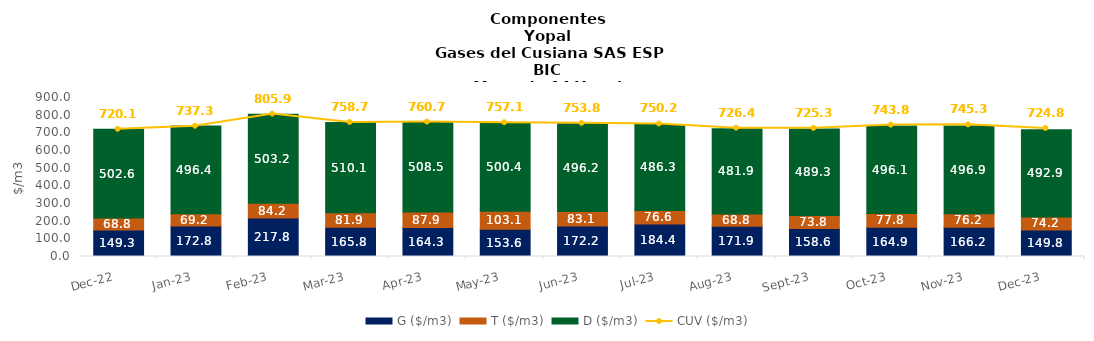
| Category | G ($/m3) | T ($/m3) | D ($/m3) |
|---|---|---|---|
| 2022-12-01 | 149.33 | 68.76 | 502.55 |
| 2023-01-01 | 172.82 | 69.18 | 496.38 |
| 2023-02-01 | 217.82 | 84.19 | 503.15 |
| 2023-03-01 | 165.84 | 81.88 | 510.12 |
| 2023-04-01 | 164.25 | 87.89 | 508.45 |
| 2023-05-01 | 153.57 | 103.08 | 500.4 |
| 2023-06-01 | 172.16 | 83.07 | 496.23 |
| 2023-07-01 | 184.42 | 76.55 | 486.26 |
| 2023-08-01 | 171.91 | 68.78 | 481.89 |
| 2023-09-01 | 158.55 | 73.83 | 489.25 |
| 2023-10-01 | 164.94 | 77.79 | 496.13 |
| 2023-11-01 | 166.18 | 76.24 | 496.87 |
| 2023-12-01 | 149.82 | 74.15 | 492.91 |